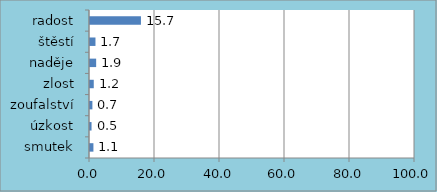
| Category | Series 0 |
|---|---|
| smutek | 1.052 |
| úzkost | 0.473 |
| zoufalství | 0.736 |
| zlost | 1.157 |
| naděje | 1.894 |
| štěstí | 1.683 |
| radost | 15.676 |